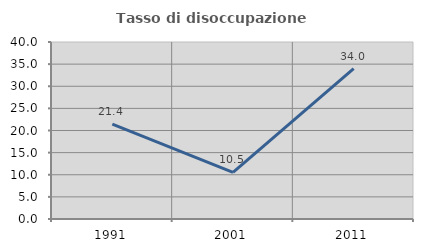
| Category | Tasso di disoccupazione giovanile  |
|---|---|
| 1991.0 | 21.429 |
| 2001.0 | 10.526 |
| 2011.0 | 34 |